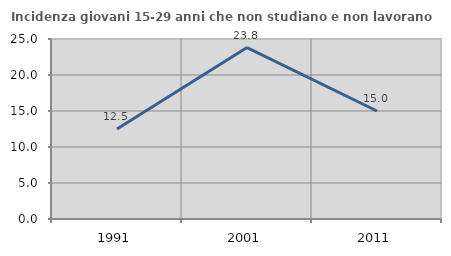
| Category | Incidenza giovani 15-29 anni che non studiano e non lavorano  |
|---|---|
| 1991.0 | 12.5 |
| 2001.0 | 23.81 |
| 2011.0 | 15 |